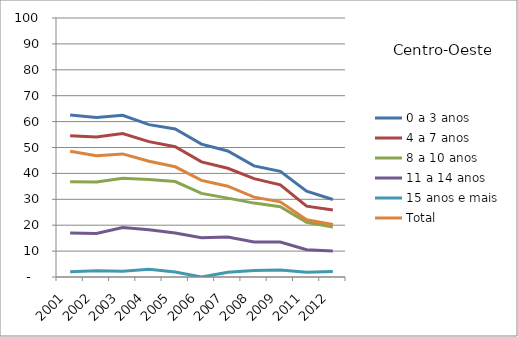
| Category | 0 a 3 anos | 4 a 7 anos | 8 a 10 anos | 11 a 14 anos | 15 anos e mais | Total |
|---|---|---|---|---|---|---|
| 2001.0 | 62.58 | 54.52 | 36.73 | 16.99 | 1.99 | 48.53 |
| 2002.0 | 61.54 | 54.08 | 36.66 | 16.82 | 2.45 | 46.86 |
| 2003.0 | 62.42 | 55.39 | 38.09 | 19.11 | 2.19 | 47.52 |
| 2004.0 | 58.82 | 52.26 | 37.69 | 18.28 | 2.97 | 44.72 |
| 2005.0 | 57.13 | 50.32 | 36.84 | 16.99 | 1.96 | 42.55 |
| 2006.0 | 51.29 | 44.44 | 32.28 | 15.19 | 0 | 37.28 |
| 2007.0 | 48.65 | 41.97 | 30.45 | 15.41 | 1.84 | 35.07 |
| 2008.0 | 42.89 | 37.98 | 28.53 | 13.54 | 2.47 | 30.84 |
| 2009.0 | 40.8 | 35.6 | 27.15 | 13.53 | 2.73 | 29.02 |
| 2011.0 | 33.15 | 27.35 | 21.13 | 10.52 | 1.88 | 22.11 |
| 2012.0 | 29.92 | 25.89 | 19.32 | 10.03 | 2.08 | 20.24 |